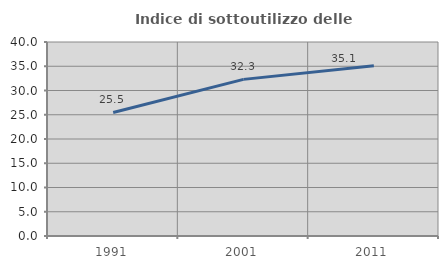
| Category | Indice di sottoutilizzo delle abitazioni  |
|---|---|
| 1991.0 | 25.47 |
| 2001.0 | 32.293 |
| 2011.0 | 35.082 |